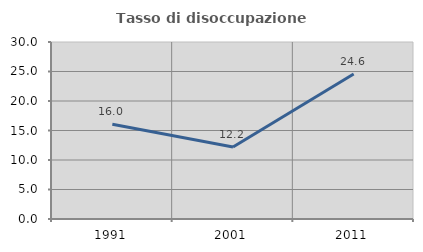
| Category | Tasso di disoccupazione giovanile  |
|---|---|
| 1991.0 | 16.047 |
| 2001.0 | 12.211 |
| 2011.0 | 24.583 |